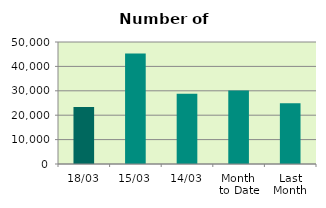
| Category | Series 0 |
|---|---|
| 18/03 | 23368 |
| 15/03 | 45258 |
| 14/03 | 28742 |
| Month 
to Date | 30131.667 |
| Last
Month | 24872.2 |